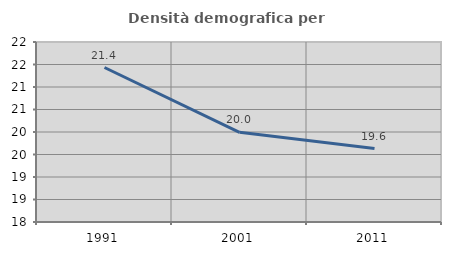
| Category | Densità demografica |
|---|---|
| 1991.0 | 21.433 |
| 2001.0 | 19.992 |
| 2011.0 | 19.632 |